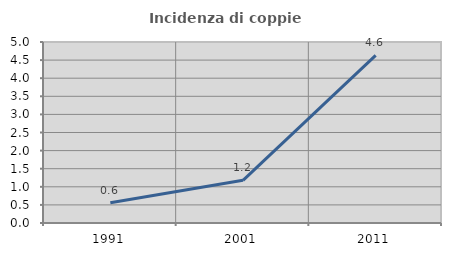
| Category | Incidenza di coppie miste |
|---|---|
| 1991.0 | 0.562 |
| 2001.0 | 1.18 |
| 2011.0 | 4.63 |